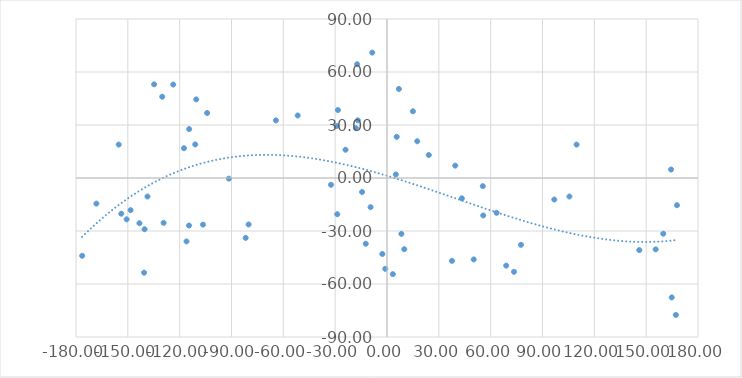
| Category | Series 0 |
|---|---|
| -176.43 | -44.03 |
| -168.2 | -14.5 |
| -155.27 | 18.92 |
| -153.8 | -20.2 |
| -150.7 | -23.4 |
| -148.4 | -18.2 |
| -143.3 | -25.6 |
| -140.6 | -53.6 |
| -140.3 | -29 |
| -138.63 | -10.48 |
| -134.8 | 53 |
| -130.1 | 46 |
| -129.3 | -25.4 |
| -123.73 | 52.9 |
| -117.52 | 16.87 |
| -116.04 | -35.9 |
| -114.6 | -26.9 |
| -114.5 | 27.7 |
| -111.0 | 19 |
| -110.4 | 44.5 |
| -106.5 | -26.4 |
| -104.1 | 36.8 |
| -91.55 | -0.37 |
| -81.8 | -33.9 |
| -80.1 | -26.29 |
| -64.3 | 32.6 |
| -51.68 | 35.39 |
| -32.42 | -3.85 |
| -29.2 | 29.4 |
| -28.8 | -20.5 |
| -28.4 | 38.47 |
| -24.0 | 16 |
| -18.0 | 28.2 |
| -17.3 | 64.4 |
| -16.91 | 32.65 |
| -14.42 | -7.93 |
| -12.3 | -37.2 |
| -9.5 | -16.5 |
| -8.53 | 70.98 |
| -2.7 | -43 |
| -1.0 | -51.4 |
| 3.38 | -54.43 |
| 5.1 | 2 |
| 5.6 | 23.3 |
| 6.87 | 50.39 |
| 8.33 | -31.63 |
| 10.0 | -40.3 |
| 15.0 | 37.76 |
| 17.5 | 20.8 |
| 24.2 | 13 |
| 37.6 | -46.9 |
| 39.5 | 7 |
| 43.3 | -11.5 |
| 50.2 | -46.1 |
| 55.45 | -4.617 |
| 55.7 | -21.2 |
| 63.42 | -19.72 |
| 69.0 | -49.6 |
| 73.5 | -53.1 |
| 77.554722 | -37.826 |
| 96.83 | -12.19 |
| 105.58 | -10.48 |
| 109.73 | 18.92 |
| 146.0 | -40.8 |
| 155.5 | -40.4 |
| 159.9 | -31.55 |
| 164.4 | 4.8 |
| 164.8 | -67.6 |
| 167.2 | -77.5 |
| 167.83 | -15.4 |